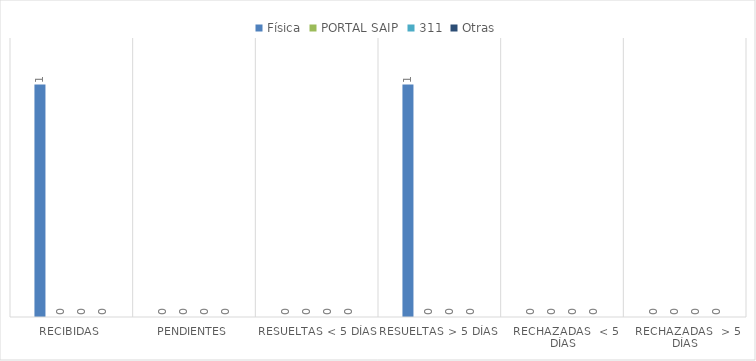
| Category | Física | PORTAL SAIP | 311 | Otras |
|---|---|---|---|---|
| Recibidas  | 1 | 0 | 0 | 0 |
| Pendientes  | 0 | 0 | 0 | 0 |
| Resueltas < 5 días | 0 | 0 | 0 | 0 |
| Resueltas > 5 días  | 1 | 0 | 0 | 0 |
| Rechazadas  < 5 días | 0 | 0 | 0 | 0 |
| Rechazadas  > 5 días | 0 | 0 | 0 | 0 |